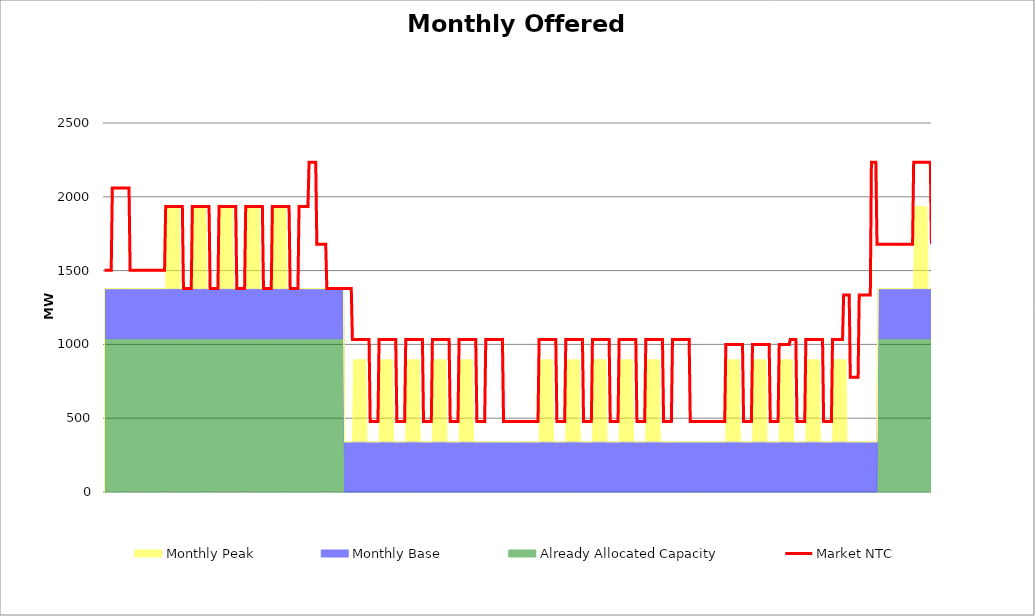
| Category | Market NTC |
|---|---|
| 0 | 1503 |
| 1 | 1503 |
| 2 | 1503 |
| 3 | 1503 |
| 4 | 1503 |
| 5 | 1503 |
| 6 | 1503 |
| 7 | 2059 |
| 8 | 2059 |
| 9 | 2059 |
| 10 | 2059 |
| 11 | 2059 |
| 12 | 2059 |
| 13 | 2059 |
| 14 | 2059 |
| 15 | 2059 |
| 16 | 2059 |
| 17 | 2059 |
| 18 | 2059 |
| 19 | 2059 |
| 20 | 2059 |
| 21 | 2059 |
| 22 | 2059 |
| 23 | 1503 |
| 24 | 1503 |
| 25 | 1503 |
| 26 | 1503 |
| 27 | 1503 |
| 28 | 1503 |
| 29 | 1503 |
| 30 | 1503 |
| 31 | 1503 |
| 32 | 1503 |
| 33 | 1503 |
| 34 | 1503 |
| 35 | 1503 |
| 36 | 1503 |
| 37 | 1503 |
| 38 | 1503 |
| 39 | 1503 |
| 40 | 1503 |
| 41 | 1503 |
| 42 | 1503 |
| 43 | 1503 |
| 44 | 1503 |
| 45 | 1503 |
| 46 | 1503 |
| 47 | 1503 |
| 48 | 1503 |
| 49 | 1503 |
| 50 | 1503 |
| 51 | 1503 |
| 52 | 1503 |
| 53 | 1503 |
| 54 | 1503 |
| 55 | 1934 |
| 56 | 1934 |
| 57 | 1934 |
| 58 | 1934 |
| 59 | 1934 |
| 60 | 1934 |
| 61 | 1934 |
| 62 | 1934 |
| 63 | 1934 |
| 64 | 1934 |
| 65 | 1934 |
| 66 | 1934 |
| 67 | 1934 |
| 68 | 1934 |
| 69 | 1934 |
| 70 | 1934 |
| 71 | 1378 |
| 72 | 1378 |
| 73 | 1378 |
| 74 | 1378 |
| 75 | 1378 |
| 76 | 1378 |
| 77 | 1378 |
| 78 | 1378 |
| 79 | 1934 |
| 80 | 1934 |
| 81 | 1934 |
| 82 | 1934 |
| 83 | 1934 |
| 84 | 1934 |
| 85 | 1934 |
| 86 | 1934 |
| 87 | 1934 |
| 88 | 1934 |
| 89 | 1934 |
| 90 | 1934 |
| 91 | 1934 |
| 92 | 1934 |
| 93 | 1934 |
| 94 | 1934 |
| 95 | 1378 |
| 96 | 1378 |
| 97 | 1378 |
| 98 | 1378 |
| 99 | 1378 |
| 100 | 1378 |
| 101 | 1378 |
| 102 | 1378 |
| 103 | 1934 |
| 104 | 1934 |
| 105 | 1934 |
| 106 | 1934 |
| 107 | 1934 |
| 108 | 1934 |
| 109 | 1934 |
| 110 | 1934 |
| 111 | 1934 |
| 112 | 1934 |
| 113 | 1934 |
| 114 | 1934 |
| 115 | 1934 |
| 116 | 1934 |
| 117 | 1934 |
| 118 | 1934 |
| 119 | 1378 |
| 120 | 1378 |
| 121 | 1378 |
| 122 | 1378 |
| 123 | 1378 |
| 124 | 1378 |
| 125 | 1378 |
| 126 | 1378 |
| 127 | 1934 |
| 128 | 1934 |
| 129 | 1934 |
| 130 | 1934 |
| 131 | 1934 |
| 132 | 1934 |
| 133 | 1934 |
| 134 | 1934 |
| 135 | 1934 |
| 136 | 1934 |
| 137 | 1934 |
| 138 | 1934 |
| 139 | 1934 |
| 140 | 1934 |
| 141 | 1934 |
| 142 | 1934 |
| 143 | 1378 |
| 144 | 1378 |
| 145 | 1378 |
| 146 | 1378 |
| 147 | 1378 |
| 148 | 1378 |
| 149 | 1378 |
| 150 | 1378 |
| 151 | 1934 |
| 152 | 1934 |
| 153 | 1934 |
| 154 | 1934 |
| 155 | 1934 |
| 156 | 1934 |
| 157 | 1934 |
| 158 | 1934 |
| 159 | 1934 |
| 160 | 1934 |
| 161 | 1934 |
| 162 | 1934 |
| 163 | 1934 |
| 164 | 1934 |
| 165 | 1934 |
| 166 | 1934 |
| 167 | 1378 |
| 168 | 1378 |
| 169 | 1378 |
| 170 | 1378 |
| 171 | 1378 |
| 172 | 1378 |
| 173 | 1378 |
| 174 | 1378 |
| 175 | 1934 |
| 176 | 1934 |
| 177 | 1934 |
| 178 | 1934 |
| 179 | 1934 |
| 180 | 1934 |
| 181 | 1934 |
| 182 | 1934 |
| 183 | 1934 |
| 184 | 2234 |
| 185 | 2234 |
| 186 | 2234 |
| 187 | 2234 |
| 188 | 2234 |
| 189 | 2234 |
| 190 | 2234 |
| 191 | 1678 |
| 192 | 1678 |
| 193 | 1678 |
| 194 | 1678 |
| 195 | 1678 |
| 196 | 1678 |
| 197 | 1678 |
| 198 | 1678 |
| 199 | 1678 |
| 200 | 1378 |
| 201 | 1378 |
| 202 | 1378 |
| 203 | 1378 |
| 204 | 1378 |
| 205 | 1378 |
| 206 | 1378 |
| 207 | 1378 |
| 208 | 1378 |
| 209 | 1378 |
| 210 | 1378 |
| 211 | 1378 |
| 212 | 1378 |
| 213 | 1378 |
| 214 | 1378 |
| 215 | 1378 |
| 216 | 1378 |
| 217 | 1378 |
| 218 | 1378 |
| 219 | 1378 |
| 220 | 1378 |
| 221 | 1378 |
| 222 | 1378 |
| 223 | 1034 |
| 224 | 1034 |
| 225 | 1034 |
| 226 | 1034 |
| 227 | 1034 |
| 228 | 1034 |
| 229 | 1034 |
| 230 | 1034 |
| 231 | 1034 |
| 232 | 1034 |
| 233 | 1034 |
| 234 | 1034 |
| 235 | 1034 |
| 236 | 1034 |
| 237 | 1034 |
| 238 | 1034 |
| 239 | 478 |
| 240 | 478 |
| 241 | 478 |
| 242 | 478 |
| 243 | 478 |
| 244 | 478 |
| 245 | 478 |
| 246 | 478 |
| 247 | 1034 |
| 248 | 1034 |
| 249 | 1034 |
| 250 | 1034 |
| 251 | 1034 |
| 252 | 1034 |
| 253 | 1034 |
| 254 | 1034 |
| 255 | 1034 |
| 256 | 1034 |
| 257 | 1034 |
| 258 | 1034 |
| 259 | 1034 |
| 260 | 1034 |
| 261 | 1034 |
| 262 | 1034 |
| 263 | 478 |
| 264 | 478 |
| 265 | 478 |
| 266 | 478 |
| 267 | 478 |
| 268 | 478 |
| 269 | 478 |
| 270 | 478 |
| 271 | 1034 |
| 272 | 1034 |
| 273 | 1034 |
| 274 | 1034 |
| 275 | 1034 |
| 276 | 1034 |
| 277 | 1034 |
| 278 | 1034 |
| 279 | 1034 |
| 280 | 1034 |
| 281 | 1034 |
| 282 | 1034 |
| 283 | 1034 |
| 284 | 1034 |
| 285 | 1034 |
| 286 | 1034 |
| 287 | 478 |
| 288 | 478 |
| 289 | 478 |
| 290 | 478 |
| 291 | 478 |
| 292 | 478 |
| 293 | 478 |
| 294 | 478 |
| 295 | 1034 |
| 296 | 1034 |
| 297 | 1034 |
| 298 | 1034 |
| 299 | 1034 |
| 300 | 1034 |
| 301 | 1034 |
| 302 | 1034 |
| 303 | 1034 |
| 304 | 1034 |
| 305 | 1034 |
| 306 | 1034 |
| 307 | 1034 |
| 308 | 1034 |
| 309 | 1034 |
| 310 | 1034 |
| 311 | 478 |
| 312 | 478 |
| 313 | 478 |
| 314 | 478 |
| 315 | 478 |
| 316 | 478 |
| 317 | 478 |
| 318 | 478 |
| 319 | 1034 |
| 320 | 1034 |
| 321 | 1034 |
| 322 | 1034 |
| 323 | 1034 |
| 324 | 1034 |
| 325 | 1034 |
| 326 | 1034 |
| 327 | 1034 |
| 328 | 1034 |
| 329 | 1034 |
| 330 | 1034 |
| 331 | 1034 |
| 332 | 1034 |
| 333 | 1034 |
| 334 | 1034 |
| 335 | 478 |
| 336 | 478 |
| 337 | 478 |
| 338 | 478 |
| 339 | 478 |
| 340 | 478 |
| 341 | 478 |
| 342 | 478 |
| 343 | 1034 |
| 344 | 1034 |
| 345 | 1034 |
| 346 | 1034 |
| 347 | 1034 |
| 348 | 1034 |
| 349 | 1034 |
| 350 | 1034 |
| 351 | 1034 |
| 352 | 1034 |
| 353 | 1034 |
| 354 | 1034 |
| 355 | 1034 |
| 356 | 1034 |
| 357 | 1034 |
| 358 | 1034 |
| 359 | 478 |
| 360 | 478 |
| 361 | 478 |
| 362 | 478 |
| 363 | 478 |
| 364 | 478 |
| 365 | 478 |
| 366 | 478 |
| 367 | 478 |
| 368 | 478 |
| 369 | 478 |
| 370 | 478 |
| 371 | 478 |
| 372 | 478 |
| 373 | 478 |
| 374 | 478 |
| 375 | 478 |
| 376 | 478 |
| 377 | 478 |
| 378 | 478 |
| 379 | 478 |
| 380 | 478 |
| 381 | 478 |
| 382 | 478 |
| 383 | 478 |
| 384 | 478 |
| 385 | 478 |
| 386 | 478 |
| 387 | 478 |
| 388 | 478 |
| 389 | 478 |
| 390 | 478 |
| 391 | 1034 |
| 392 | 1034 |
| 393 | 1034 |
| 394 | 1034 |
| 395 | 1034 |
| 396 | 1034 |
| 397 | 1034 |
| 398 | 1034 |
| 399 | 1034 |
| 400 | 1034 |
| 401 | 1034 |
| 402 | 1034 |
| 403 | 1034 |
| 404 | 1034 |
| 405 | 1034 |
| 406 | 1034 |
| 407 | 478 |
| 408 | 478 |
| 409 | 478 |
| 410 | 478 |
| 411 | 478 |
| 412 | 478 |
| 413 | 478 |
| 414 | 478 |
| 415 | 1034 |
| 416 | 1034 |
| 417 | 1034 |
| 418 | 1034 |
| 419 | 1034 |
| 420 | 1034 |
| 421 | 1034 |
| 422 | 1034 |
| 423 | 1034 |
| 424 | 1034 |
| 425 | 1034 |
| 426 | 1034 |
| 427 | 1034 |
| 428 | 1034 |
| 429 | 1034 |
| 430 | 1034 |
| 431 | 478 |
| 432 | 478 |
| 433 | 478 |
| 434 | 478 |
| 435 | 478 |
| 436 | 478 |
| 437 | 478 |
| 438 | 478 |
| 439 | 1034 |
| 440 | 1034 |
| 441 | 1034 |
| 442 | 1034 |
| 443 | 1034 |
| 444 | 1034 |
| 445 | 1034 |
| 446 | 1034 |
| 447 | 1034 |
| 448 | 1034 |
| 449 | 1034 |
| 450 | 1034 |
| 451 | 1034 |
| 452 | 1034 |
| 453 | 1034 |
| 454 | 1034 |
| 455 | 478 |
| 456 | 478 |
| 457 | 478 |
| 458 | 478 |
| 459 | 478 |
| 460 | 478 |
| 461 | 478 |
| 462 | 478 |
| 463 | 1034 |
| 464 | 1034 |
| 465 | 1034 |
| 466 | 1034 |
| 467 | 1034 |
| 468 | 1034 |
| 469 | 1034 |
| 470 | 1034 |
| 471 | 1034 |
| 472 | 1034 |
| 473 | 1034 |
| 474 | 1034 |
| 475 | 1034 |
| 476 | 1034 |
| 477 | 1034 |
| 478 | 1034 |
| 479 | 478 |
| 480 | 478 |
| 481 | 478 |
| 482 | 478 |
| 483 | 478 |
| 484 | 478 |
| 485 | 478 |
| 486 | 478 |
| 487 | 1034 |
| 488 | 1034 |
| 489 | 1034 |
| 490 | 1034 |
| 491 | 1034 |
| 492 | 1034 |
| 493 | 1034 |
| 494 | 1034 |
| 495 | 1034 |
| 496 | 1034 |
| 497 | 1034 |
| 498 | 1034 |
| 499 | 1034 |
| 500 | 1034 |
| 501 | 1034 |
| 502 | 1034 |
| 503 | 478 |
| 504 | 478 |
| 505 | 478 |
| 506 | 478 |
| 507 | 478 |
| 508 | 478 |
| 509 | 478 |
| 510 | 478 |
| 511 | 1034 |
| 512 | 1034 |
| 513 | 1034 |
| 514 | 1034 |
| 515 | 1034 |
| 516 | 1034 |
| 517 | 1034 |
| 518 | 1034 |
| 519 | 1034 |
| 520 | 1034 |
| 521 | 1034 |
| 522 | 1034 |
| 523 | 1034 |
| 524 | 1034 |
| 525 | 1034 |
| 526 | 1034 |
| 527 | 478 |
| 528 | 478 |
| 529 | 478 |
| 530 | 478 |
| 531 | 478 |
| 532 | 478 |
| 533 | 478 |
| 534 | 478 |
| 535 | 478 |
| 536 | 478 |
| 537 | 478 |
| 538 | 478 |
| 539 | 478 |
| 540 | 478 |
| 541 | 478 |
| 542 | 478 |
| 543 | 478 |
| 544 | 478 |
| 545 | 478 |
| 546 | 478 |
| 547 | 478 |
| 548 | 478 |
| 549 | 478 |
| 550 | 478 |
| 551 | 478 |
| 552 | 478 |
| 553 | 478 |
| 554 | 478 |
| 555 | 478 |
| 556 | 478 |
| 557 | 478 |
| 558 | 478 |
| 559 | 999 |
| 560 | 999 |
| 561 | 999 |
| 562 | 999 |
| 563 | 999 |
| 564 | 999 |
| 565 | 999 |
| 566 | 999 |
| 567 | 999 |
| 568 | 999 |
| 569 | 999 |
| 570 | 999 |
| 571 | 999 |
| 572 | 999 |
| 573 | 999 |
| 574 | 999 |
| 575 | 478 |
| 576 | 478 |
| 577 | 478 |
| 578 | 478 |
| 579 | 478 |
| 580 | 478 |
| 581 | 478 |
| 582 | 478 |
| 583 | 999 |
| 584 | 999 |
| 585 | 999 |
| 586 | 999 |
| 587 | 999 |
| 588 | 999 |
| 589 | 999 |
| 590 | 999 |
| 591 | 999 |
| 592 | 999 |
| 593 | 999 |
| 594 | 999 |
| 595 | 999 |
| 596 | 999 |
| 597 | 999 |
| 598 | 999 |
| 599 | 478 |
| 600 | 478 |
| 601 | 478 |
| 602 | 478 |
| 603 | 478 |
| 604 | 478 |
| 605 | 478 |
| 606 | 478 |
| 607 | 999 |
| 608 | 999 |
| 609 | 999 |
| 610 | 999 |
| 611 | 999 |
| 612 | 999 |
| 613 | 999 |
| 614 | 999 |
| 615 | 999 |
| 616 | 999 |
| 617 | 1034 |
| 618 | 1034 |
| 619 | 1034 |
| 620 | 1034 |
| 621 | 1034 |
| 622 | 1034 |
| 623 | 478 |
| 624 | 478 |
| 625 | 478 |
| 626 | 478 |
| 627 | 478 |
| 628 | 478 |
| 629 | 478 |
| 630 | 478 |
| 631 | 1034 |
| 632 | 1034 |
| 633 | 1034 |
| 634 | 1034 |
| 635 | 1034 |
| 636 | 1034 |
| 637 | 1034 |
| 638 | 1034 |
| 639 | 1034 |
| 640 | 1034 |
| 641 | 1034 |
| 642 | 1034 |
| 643 | 1034 |
| 644 | 1034 |
| 645 | 1034 |
| 646 | 1034 |
| 647 | 478 |
| 648 | 478 |
| 649 | 478 |
| 650 | 478 |
| 651 | 478 |
| 652 | 478 |
| 653 | 478 |
| 654 | 478 |
| 655 | 1034 |
| 656 | 1034 |
| 657 | 1034 |
| 658 | 1034 |
| 659 | 1034 |
| 660 | 1034 |
| 661 | 1034 |
| 662 | 1034 |
| 663 | 1034 |
| 664 | 1034 |
| 665 | 1334 |
| 666 | 1334 |
| 667 | 1334 |
| 668 | 1334 |
| 669 | 1334 |
| 670 | 1334 |
| 671 | 778 |
| 672 | 778 |
| 673 | 778 |
| 674 | 778 |
| 675 | 778 |
| 676 | 778 |
| 677 | 778 |
| 678 | 778 |
| 679 | 1334 |
| 680 | 1334 |
| 681 | 1334 |
| 682 | 1334 |
| 683 | 1334 |
| 684 | 1334 |
| 685 | 1334 |
| 686 | 1334 |
| 687 | 1334 |
| 688 | 1334 |
| 689 | 1334 |
| 690 | 2234 |
| 691 | 2234 |
| 692 | 2234 |
| 693 | 2234 |
| 694 | 2234 |
| 695 | 1678 |
| 696 | 1678 |
| 697 | 1678 |
| 698 | 1678 |
| 699 | 1678 |
| 700 | 1678 |
| 701 | 1678 |
| 702 | 1678 |
| 703 | 1678 |
| 704 | 1678 |
| 705 | 1678 |
| 706 | 1678 |
| 707 | 1678 |
| 708 | 1678 |
| 709 | 1678 |
| 710 | 1678 |
| 711 | 1678 |
| 712 | 1678 |
| 713 | 1678 |
| 714 | 1678 |
| 715 | 1678 |
| 716 | 1678 |
| 717 | 1678 |
| 718 | 1678 |
| 719 | 1678 |
| 720 | 1678 |
| 721 | 1678 |
| 722 | 1678 |
| 723 | 1678 |
| 724 | 1678 |
| 725 | 1678 |
| 726 | 1678 |
| 727 | 1678 |
| 728 | 2234 |
| 729 | 2234 |
| 730 | 2234 |
| 731 | 2234 |
| 732 | 2234 |
| 733 | 2234 |
| 734 | 2234 |
| 735 | 2234 |
| 736 | 2234 |
| 737 | 2234 |
| 738 | 2234 |
| 739 | 2234 |
| 740 | 2234 |
| 741 | 2234 |
| 742 | 2234 |
| 743 | 2234 |
| 744 | 1678 |